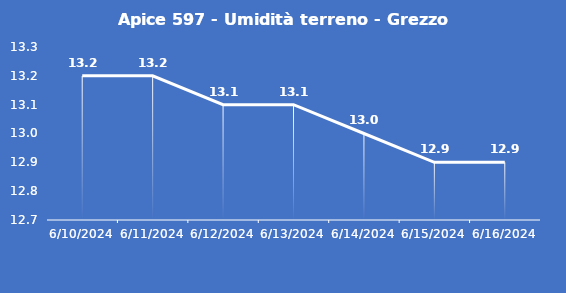
| Category | Apice 597 - Umidità terreno - Grezzo (%VWC) |
|---|---|
| 6/10/24 | 13.2 |
| 6/11/24 | 13.2 |
| 6/12/24 | 13.1 |
| 6/13/24 | 13.1 |
| 6/14/24 | 13 |
| 6/15/24 | 12.9 |
| 6/16/24 | 12.9 |